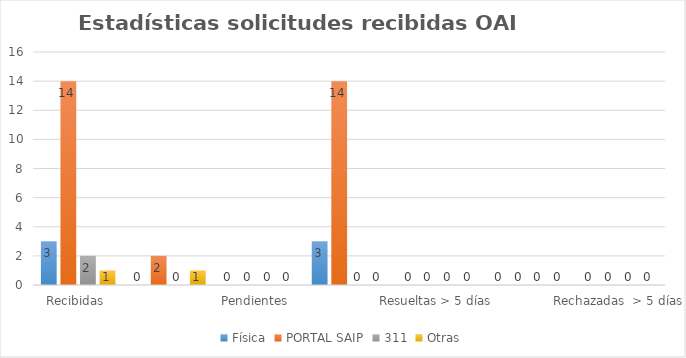
| Category | Física | PORTAL SAIP | 311 | Otras |
|---|---|---|---|---|
| Recibidas  | 3 | 14 | 2 | 1 |
| Cambiadas a otra institución | 0 | 2 | 0 | 1 |
| Pendientes  | 0 | 0 | 0 | 0 |
| Resueltas < 5 días | 3 | 14 | 0 | 0 |
| Resueltas > 5 días  | 0 | 0 | 0 | 0 |
| Rechazadas  < 5 días | 0 | 0 | 0 | 0 |
| Rechazadas  > 5 días | 0 | 0 | 0 | 0 |